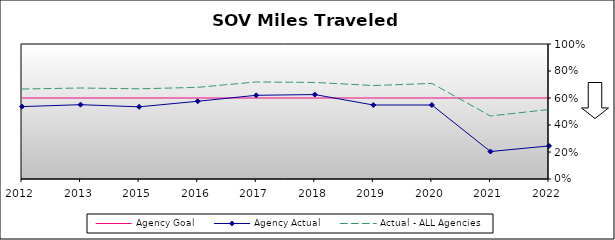
| Category | Agency Goal | Agency Actual | Actual - ALL Agencies |
|---|---|---|---|
| 2012.0 | 0.6 | 0.536 | 0.666 |
| 2013.0 | 0.6 | 0.55 | 0.674 |
| 2015.0 | 0.6 | 0.535 | 0.668 |
| 2016.0 | 0.6 | 0.576 | 0.679 |
| 2017.0 | 0.6 | 0.62 | 0.719 |
| 2018.0 | 0.6 | 0.626 | 0.715 |
| 2019.0 | 0.6 | 0.548 | 0.692 |
| 2020.0 | 0.6 | 0.548 | 0.708 |
| 2021.0 | 0.6 | 0.203 | 0.467 |
| 2022.0 | 0.6 | 0.245 | 0.515 |